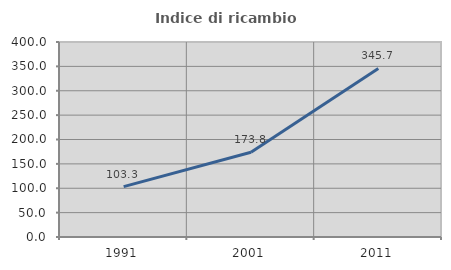
| Category | Indice di ricambio occupazionale  |
|---|---|
| 1991.0 | 103.328 |
| 2001.0 | 173.79 |
| 2011.0 | 345.743 |